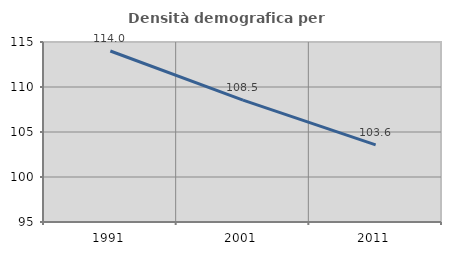
| Category | Densità demografica |
|---|---|
| 1991.0 | 113.997 |
| 2001.0 | 108.534 |
| 2011.0 | 103.574 |